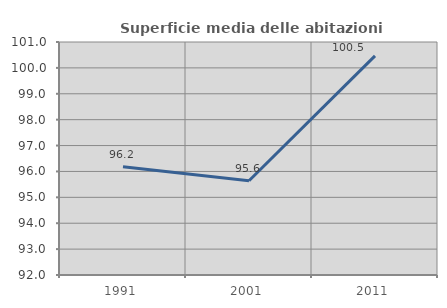
| Category | Superficie media delle abitazioni occupate |
|---|---|
| 1991.0 | 96.178 |
| 2001.0 | 95.642 |
| 2011.0 | 100.464 |